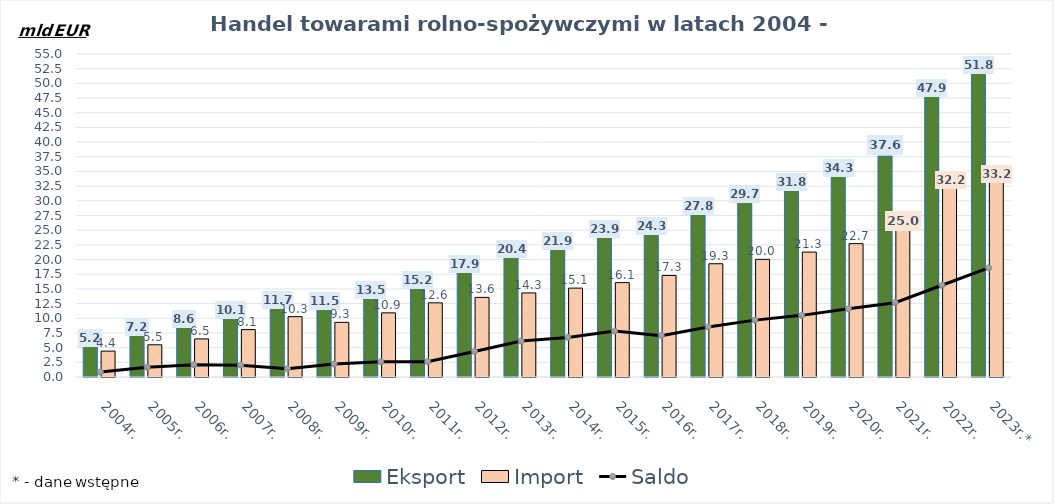
| Category | Eksport | Import |
|---|---|---|
| 2004r. | 5.242 | 4.406 |
| 2005r. | 7.152 | 5.485 |
| 2006r. | 8.577 | 6.486 |
| 2007r. | 10.089 | 8.07 |
| 2008r. | 11.692 | 10.277 |
| 2009r. | 11.499 | 9.299 |
| 2010r. | 13.507 | 10.921 |
| 2011r. | 15.228 | 12.628 |
| 2012r. | 17.893 | 13.557 |
| 2013r. | 20.427 | 14.313 |
| 2014r. | 21.876 | 15.134 |
| 2015r. | 23.887 | 16.068 |
| 2016r. | 24.332 | 17.292 |
| 2017r. | 27.813 | 19.285 |
| 2018r. | 29.717 | 20.033 |
| 2019r. | 31.766 | 21.27 |
| 2020r. | 34.31 | 22.703 |
| 2021r. | 37.611 | 24.967 |
| 2022r. | 47.867 | 32.247 |
| 2023r.* | 51.755 | 33.176 |